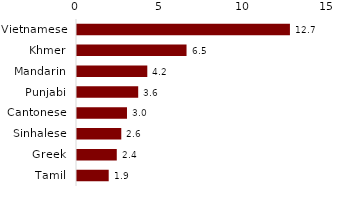
| Category | Series 0 |
|---|---|
| Vietnamese | 12.675 |
| Khmer | 6.52 |
| Mandarin | 4.184 |
| Punjabi | 3.643 |
| Cantonese | 2.976 |
| Sinhalese | 2.636 |
| Greek | 2.368 |
| Tamil | 1.887 |